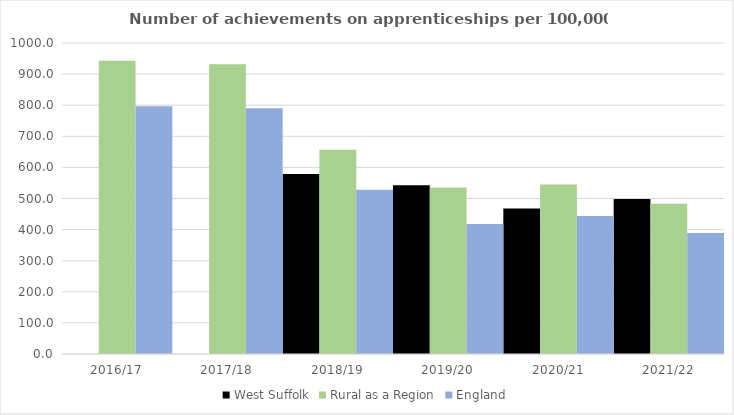
| Category | West Suffolk | Rural as a Region | England |
|---|---|---|---|
| 2016/17 | 0 | 942.594 | 797 |
| 2017/18 | 0 | 931.709 | 790 |
| 2018/19 | 579 | 656.44 | 528 |
| 2019/20 | 543 | 535.552 | 418 |
| 2020/21 | 468 | 545.333 | 444 |
| 2021/22 | 498 | 482.936 | 389 |